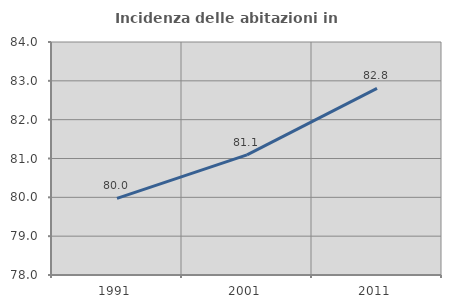
| Category | Incidenza delle abitazioni in proprietà  |
|---|---|
| 1991.0 | 79.974 |
| 2001.0 | 81.092 |
| 2011.0 | 82.805 |